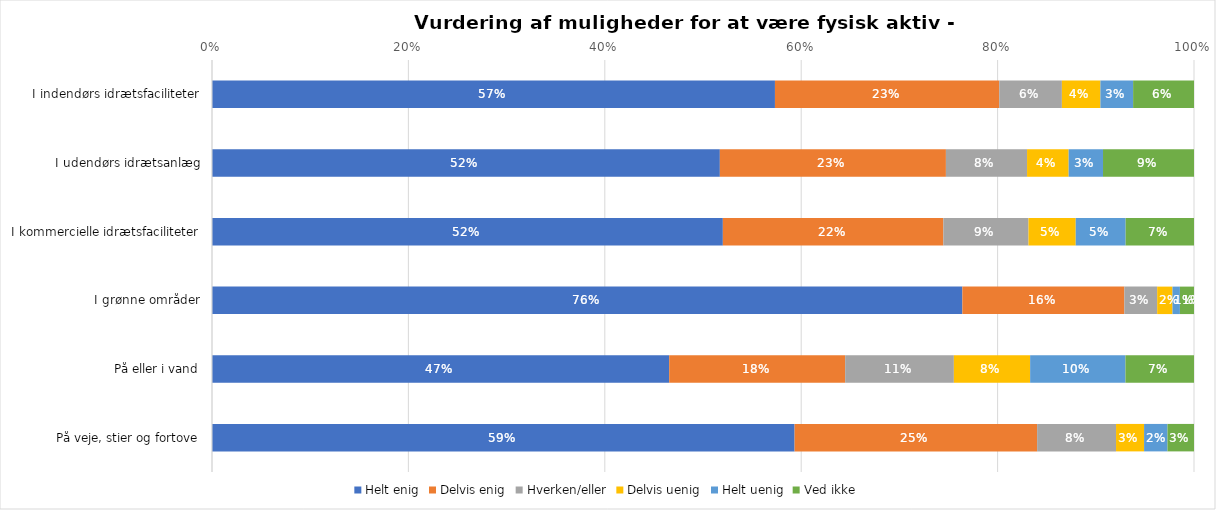
| Category | Helt enig | Delvis enig | Hverken/eller | Delvis uenig | Helt uenig | Ved ikke |
|---|---|---|---|---|---|---|
| I indendørs idrætsfaciliteter | 0.573 | 0.228 | 0.064 | 0.039 | 0.033 | 0.062 |
| I udendørs idrætsanlæg | 0.517 | 0.23 | 0.083 | 0.042 | 0.035 | 0.093 |
| I kommercielle idrætsfaciliteter | 0.52 | 0.225 | 0.087 | 0.048 | 0.051 | 0.07 |
| I grønne områder | 0.764 | 0.165 | 0.033 | 0.016 | 0.008 | 0.014 |
| På eller i vand | 0.466 | 0.179 | 0.111 | 0.078 | 0.097 | 0.07 |
| På veje, stier og fortove | 0.593 | 0.247 | 0.08 | 0.029 | 0.024 | 0.027 |